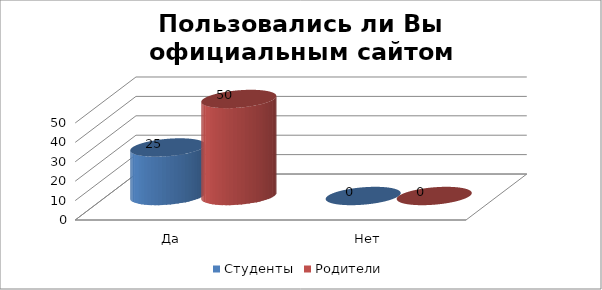
| Category | Студенты | Родители |
|---|---|---|
| Да | 25 | 50 |
| Нет | 0 | 0 |